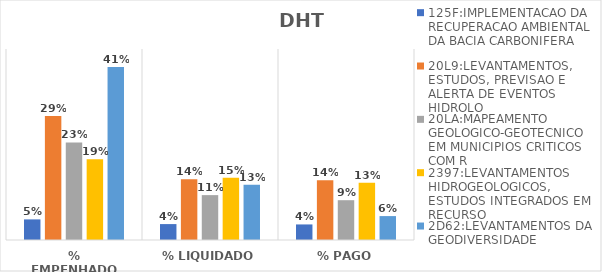
| Category | 125F:IMPLEMENTACAO DA RECUPERACAO AMBIENTAL DA BACIA CARBONIFERA | 20L9:LEVANTAMENTOS, ESTUDOS, PREVISAO E ALERTA DE EVENTOS HIDROLO | 20LA:MAPEAMENTO GEOLOGICO-GEOTECNICO EM MUNICIPIOS CRITICOS COM R | 2397:LEVANTAMENTOS HIDROGEOLOGICOS, ESTUDOS INTEGRADOS EM RECURSO | 2D62:LEVANTAMENTOS DA GEODIVERSIDADE |
|---|---|---|---|---|---|
| % EMPENHADO | 0.049 | 0.292 | 0.23 | 0.19 | 0.408 |
| % LIQUIDADO | 0.038 | 0.143 | 0.106 | 0.146 | 0.13 |
| % PAGO | 0.037 | 0.141 | 0.094 | 0.135 | 0.056 |